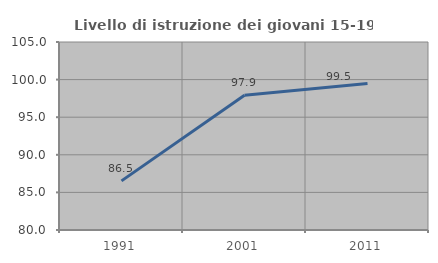
| Category | Livello di istruzione dei giovani 15-19 anni |
|---|---|
| 1991.0 | 86.535 |
| 2001.0 | 97.931 |
| 2011.0 | 99.476 |